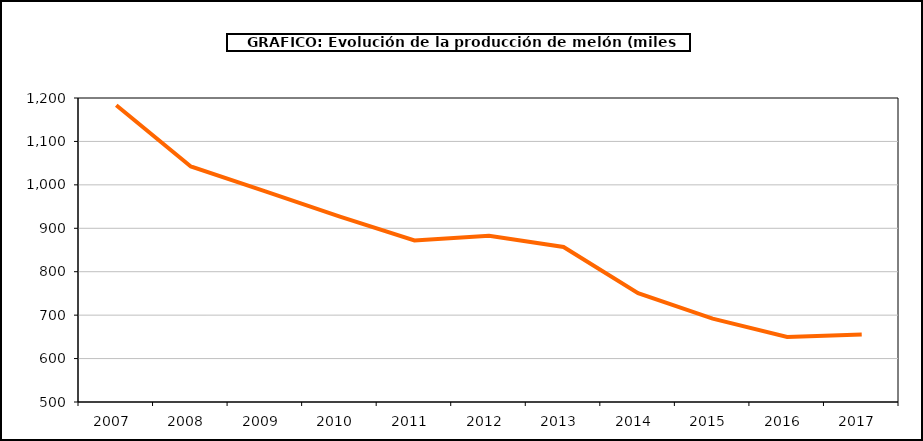
| Category | producción |
|---|---|
| 2007.0 | 1183.154 |
| 2008.0 | 1042.439 |
| 2009.0 | 984.786 |
| 2010.0 | 926.693 |
| 2011.0 | 871.996 |
| 2012.0 | 882.869 |
| 2013.0 | 856.951 |
| 2014.0 | 750.592 |
| 2015.0 | 692.056 |
| 2016.0 | 649.767 |
| 2017.0 | 655.677 |